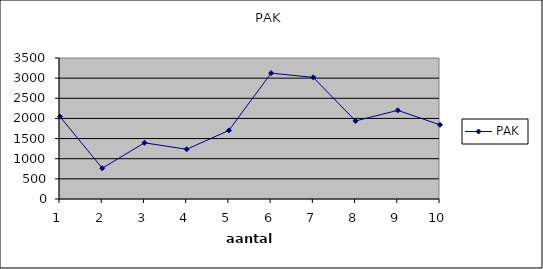
| Category | PAK |
|---|---|
| 0 | 2045 |
| 1 | 764 |
| 2 | 1395 |
| 3 | 1234 |
| 4 | 1703 |
| 5 | 3124 |
| 6 | 3018 |
| 7 | 1938 |
| 8 | 2201 |
| 9 | 1841 |